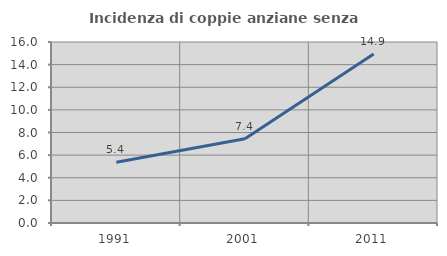
| Category | Incidenza di coppie anziane senza figli  |
|---|---|
| 1991.0 | 5.369 |
| 2001.0 | 7.447 |
| 2011.0 | 14.94 |